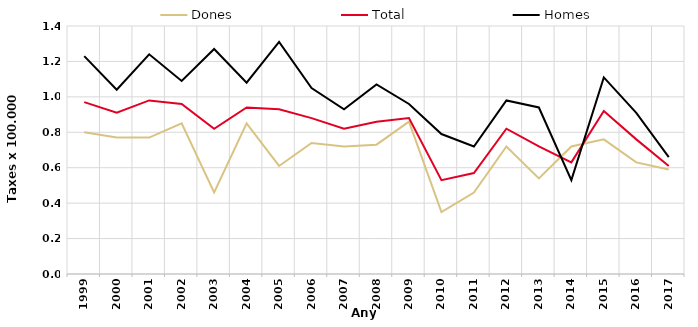
| Category | Dones | Total | Homes |
|---|---|---|---|
| 1999.0 | 0.8 | 0.97 | 1.23 |
| 2000.0 | 0.77 | 0.91 | 1.04 |
| 2001.0 | 0.77 | 0.98 | 1.24 |
| 2002.0 | 0.85 | 0.96 | 1.09 |
| 2003.0 | 0.46 | 0.82 | 1.27 |
| 2004.0 | 0.85 | 0.94 | 1.08 |
| 2005.0 | 0.61 | 0.93 | 1.31 |
| 2006.0 | 0.74 | 0.88 | 1.05 |
| 2007.0 | 0.72 | 0.82 | 0.93 |
| 2008.0 | 0.73 | 0.86 | 1.07 |
| 2009.0 | 0.86 | 0.88 | 0.96 |
| 2010.0 | 0.35 | 0.53 | 0.79 |
| 2011.0 | 0.46 | 0.57 | 0.72 |
| 2012.0 | 0.72 | 0.82 | 0.98 |
| 2013.0 | 0.54 | 0.72 | 0.94 |
| 2014.0 | 0.72 | 0.63 | 0.53 |
| 2015.0 | 0.76 | 0.92 | 1.11 |
| 2016.0 | 0.63 | 0.76 | 0.91 |
| 2017.0 | 0.59 | 0.61 | 0.66 |